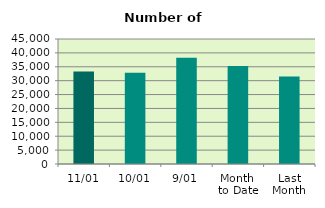
| Category | Series 0 |
|---|---|
| 11/01 | 33342 |
| 10/01 | 32892 |
| 9/01 | 38230 |
| Month 
to Date | 35275 |
| Last
Month | 31517.905 |